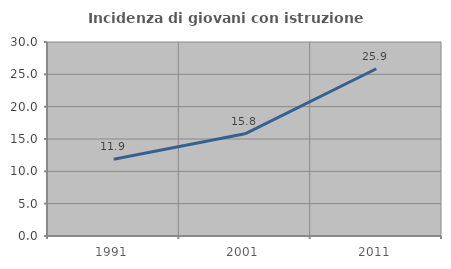
| Category | Incidenza di giovani con istruzione universitaria |
|---|---|
| 1991.0 | 11.883 |
| 2001.0 | 15.802 |
| 2011.0 | 25.864 |